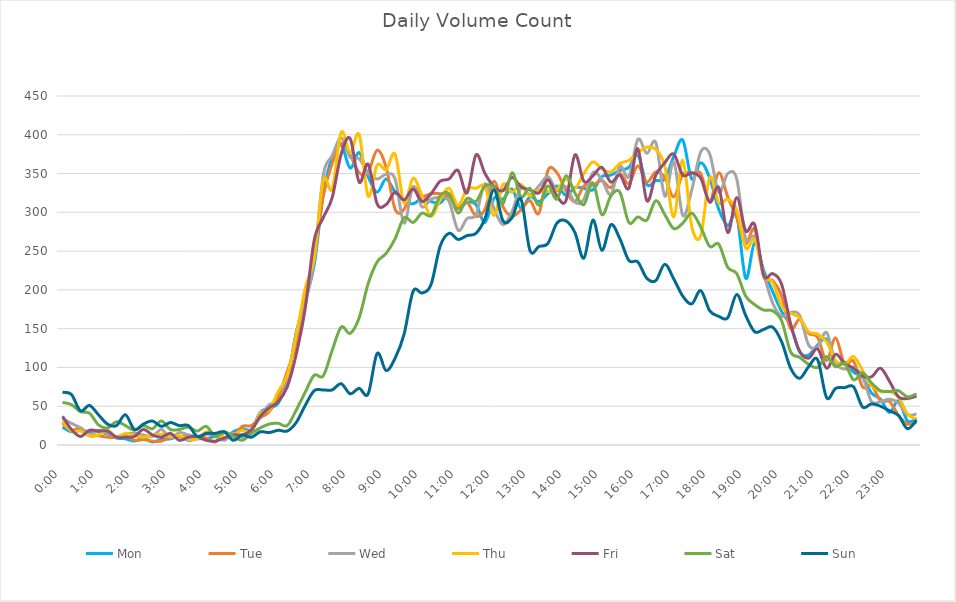
| Category | Mon | Tue | Wed | Thu | Fri | Sat | Sun |
|---|---|---|---|---|---|---|---|
| 0.0 | 23 | 28 | 34 | 30 | 37 | 55 | 68 |
| 0.010416666666666666 | 17 | 19 | 28 | 18 | 20 | 52 | 65 |
| 0.020833333333333332 | 19 | 22 | 22 | 18 | 11 | 43 | 44 |
| 0.03125 | 17 | 12 | 13 | 12 | 19 | 41 | 51 |
| 0.041666666666666664 | 17 | 12 | 19 | 13 | 18 | 26 | 39 |
| 0.05208333333333333 | 14 | 10 | 15 | 19 | 18 | 22 | 27 |
| 0.06249999999999999 | 9 | 10 | 11 | 10 | 10 | 30 | 25 |
| 0.07291666666666666 | 8 | 12 | 14 | 15 | 10 | 25 | 39 |
| 0.08333333333333333 | 5 | 6 | 15 | 12 | 11 | 19 | 20 |
| 0.09375 | 9 | 7 | 13 | 10 | 20 | 25 | 27 |
| 0.10416666666666667 | 4 | 5 | 11 | 12 | 13 | 21 | 31 |
| 0.11458333333333334 | 7 | 5 | 20 | 14 | 10 | 31 | 24 |
| 0.125 | 8 | 10 | 9 | 11 | 15 | 20 | 29 |
| 0.13541666666666666 | 11 | 11 | 16 | 12 | 6 | 20 | 25 |
| 0.14583333333333331 | 6 | 11 | 13 | 7 | 10 | 23 | 25 |
| 0.15624999999999997 | 8 | 11 | 11 | 8 | 11 | 18 | 11 |
| 0.16666666666666663 | 8 | 9 | 14 | 17 | 6 | 24 | 15 |
| 0.1770833333333333 | 11 | 4 | 12 | 14 | 5 | 11 | 15 |
| 0.18749999999999994 | 8 | 16 | 6 | 10 | 9 | 17 | 17 |
| 0.1979166666666666 | 17 | 12 | 15 | 13 | 13 | 11 | 6 |
| 0.20833333333333326 | 21 | 24 | 10 | 19 | 13 | 6 | 13 |
| 0.21874999999999992 | 20 | 25 | 20 | 17 | 19 | 15 | 10 |
| 0.22916666666666657 | 42 | 35 | 36 | 41 | 37 | 22 | 17 |
| 0.23958333333333323 | 48 | 43 | 52 | 45 | 48 | 27 | 16 |
| 0.2499999999999999 | 54 | 62 | 56 | 69 | 56 | 28 | 19 |
| 0.2604166666666666 | 84 | 95 | 81 | 90 | 75 | 25 | 18 |
| 0.27083333333333326 | 145 | 131 | 144 | 141 | 117 | 45 | 29 |
| 0.28124999999999994 | 187 | 195 | 182 | 202 | 176 | 68 | 51 |
| 0.29166666666666663 | 232 | 242 | 238 | 241 | 264 | 90 | 70 |
| 0.3020833333333333 | 323 | 321 | 347 | 341 | 293 | 89 | 71 |
| 0.3125 | 371 | 363 | 373 | 330 | 319 | 122 | 71 |
| 0.3229166666666667 | 387 | 389 | 396 | 403 | 375 | 152 | 79 |
| 0.33333333333333337 | 357 | 374 | 371 | 377 | 395 | 144 | 66 |
| 0.34375000000000006 | 377 | 351 | 369 | 400 | 339 | 164 | 73 |
| 0.35416666666666674 | 346 | 352 | 351 | 321 | 362 | 208 | 66 |
| 0.3645833333333334 | 326 | 380 | 343 | 361 | 311 | 236 | 118 |
| 0.3750000000000001 | 343 | 358 | 349 | 355 | 310 | 247 | 96 |
| 0.3854166666666668 | 326 | 304 | 343 | 375 | 326 | 266 | 112 |
| 0.3958333333333335 | 315 | 304 | 286 | 312 | 316 | 293 | 143 |
| 0.40625000000000017 | 311 | 332 | 333 | 344 | 330 | 287 | 198 |
| 0.41666666666666685 | 318 | 321 | 307 | 321 | 314 | 299 | 196 |
| 0.4270833333333333 | 314 | 324 | 317 | 295 | 324 | 296 | 207 |
| 0.4375000000000002 | 312 | 324 | 319 | 316 | 340 | 321 | 256 |
| 0.4479166666666669 | 322 | 320 | 314 | 331 | 343 | 324 | 273 |
| 0.4583333333333333 | 305 | 306 | 277 | 309 | 354 | 299 | 265 |
| 0.4687500000000003 | 313 | 313 | 292 | 330 | 325 | 318 | 270 |
| 0.47916666666666696 | 310 | 295 | 297 | 331 | 374 | 314 | 273 |
| 0.4895833333333333 | 287 | 304 | 337 | 333 | 350 | 334 | 292 |
| 0.5000000000000003 | 318 | 340 | 305 | 296 | 333 | 332 | 329 |
| 0.510416666666667 | 317 | 307 | 284 | 336 | 328 | 311 | 289 |
| 0.5208333333333334 | 330 | 295 | 301 | 326 | 345 | 351 | 293 |
| 0.5312500000000002 | 305 | 303 | 331 | 336 | 333 | 320 | 317 |
| 0.5416666666666669 | 320 | 315 | 323 | 321 | 329 | 331 | 251 |
| 0.5520833333333335 | 314 | 299 | 334 | 329 | 325 | 309 | 256 |
| 0.5625000000000001 | 324 | 354 | 346 | 327 | 342 | 334 | 260 |
| 0.5729166666666667 | 334 | 351 | 328 | 329 | 321 | 317 | 286 |
| 0.5833333333333334 | 322 | 328 | 333 | 343 | 315 | 347 | 289 |
| 0.59375 | 332 | 314 | 313 | 331 | 374 | 325 | 274 |
| 0.6041666666666666 | 331 | 334 | 317 | 350 | 340 | 310 | 241 |
| 0.6145833333333333 | 329 | 335 | 351 | 365 | 347 | 338 | 290 |
| 0.6249999999999999 | 346 | 341 | 342 | 356 | 358 | 297 | 251 |
| 0.6354166666666665 | 348 | 332 | 323 | 352 | 339 | 321 | 284 |
| 0.6458333333333331 | 354 | 350 | 359 | 363 | 348 | 326 | 266 |
| 0.6562499999999998 | 358 | 337 | 346 | 367 | 331 | 287 | 238 |
| 0.6666666666666666 | 374 | 360 | 394 | 377 | 382 | 294 | 236 |
| 0.677083333333333 | 336 | 339 | 376 | 384 | 315 | 290 | 215 |
| 0.6874999999999997 | 341 | 352 | 390 | 381 | 348 | 315 | 212 |
| 0.6979166666666666 | 343 | 345 | 321 | 360 | 364 | 297 | 233 |
| 0.7083333333333329 | 372 | 320 | 365 | 294 | 375 | 279 | 214 |
| 0.7187499999999996 | 393 | 349 | 296 | 367 | 348 | 286 | 192 |
| 0.7291666666666666 | 343 | 350 | 329 | 282 | 351 | 299 | 182 |
| 0.7395833333333328 | 364 | 350 | 378 | 270 | 344 | 281 | 199 |
| 0.75 | 344 | 314 | 375 | 345 | 313 | 256 | 173 |
| 0.7604166666666666 | 304 | 351 | 326 | 312 | 332 | 259 | 166 |
| 0.7708333333333327 | 283 | 320 | 350 | 317 | 274 | 229 | 164 |
| 0.78125 | 296 | 293 | 343 | 303 | 319 | 221 | 194 |
| 0.7916666666666666 | 215 | 260 | 266 | 254 | 276 | 192 | 167 |
| 0.8020833333333326 | 261 | 278 | 268 | 265 | 284 | 181 | 146 |
| 0.8125 | 225 | 217 | 221 | 219 | 219 | 174 | 149 |
| 0.8229166666666666 | 198 | 212 | 183 | 210 | 221 | 173 | 152 |
| 0.8333333333333334 | 172 | 192 | 166 | 179 | 207 | 160 | 133 |
| 0.84375 | 154 | 150 | 171 | 170 | 156 | 120 | 99 |
| 0.8541666666666666 | 120 | 162 | 167 | 164 | 121 | 113 | 86 |
| 0.8645833333333334 | 116 | 144 | 129 | 146 | 112 | 104 | 101 |
| 0.875 | 129 | 139 | 127 | 143 | 124 | 100 | 110 |
| 0.8854166666666666 | 136 | 109 | 145 | 133 | 99 | 114 | 61 |
| 0.8958333333333334 | 105 | 138 | 106 | 109 | 117 | 101 | 73 |
| 0.90625 | 107 | 104 | 98 | 104 | 105 | 105 | 74 |
| 0.9166666666666666 | 94 | 108 | 100 | 114 | 99 | 84 | 75 |
| 0.9270833333333334 | 87 | 75 | 88 | 96 | 89 | 93 | 49 |
| 0.9375 | 67 | 77 | 56 | 77 | 88 | 80 | 53 |
| 0.9479166666666666 | 59 | 57 | 56 | 69 | 99 | 70 | 50 |
| 0.9583333333333334 | 42 | 56 | 59 | 69 | 82 | 69 | 44 |
| 0.96875 | 57 | 38 | 54 | 62 | 62 | 70 | 38 |
| 0.9791666666666666 | 31 | 27 | 39 | 40 | 60 | 62 | 21 |
| 0.9895833333333334 | 34 | 29 | 40 | 33 | 63 | 66 | 32 |